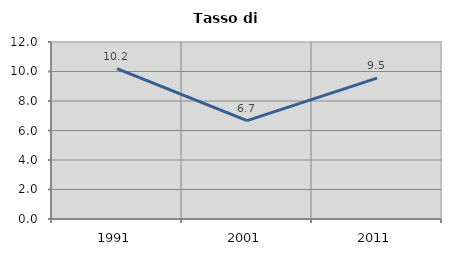
| Category | Tasso di disoccupazione   |
|---|---|
| 1991.0 | 10.194 |
| 2001.0 | 6.672 |
| 2011.0 | 9.547 |